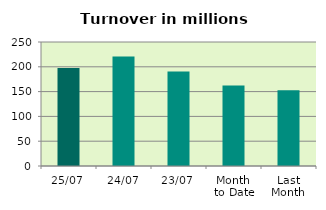
| Category | Series 0 |
|---|---|
| 25/07 | 197.512 |
| 24/07 | 220.872 |
| 23/07 | 190.29 |
| Month 
to Date | 162.314 |
| Last
Month | 152.535 |